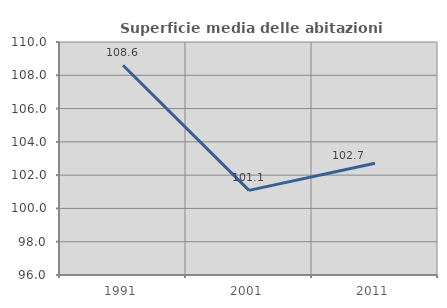
| Category | Superficie media delle abitazioni occupate |
|---|---|
| 1991.0 | 108.602 |
| 2001.0 | 101.083 |
| 2011.0 | 102.712 |